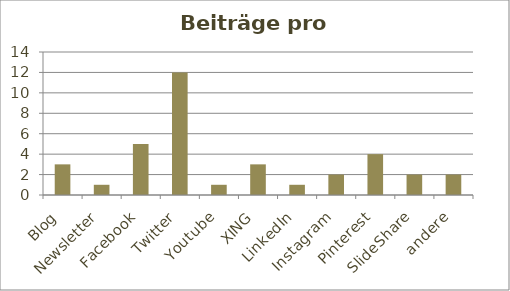
| Category | Beiträge |
|---|---|
| Blog | 3 |
| Newsletter | 1 |
| Facebook | 5 |
| Twitter | 12 |
| Youtube | 1 |
| XING | 3 |
| LinkedIn | 1 |
| Instagram | 2 |
| Pinterest | 4 |
| SlideShare | 2 |
| andere | 2 |